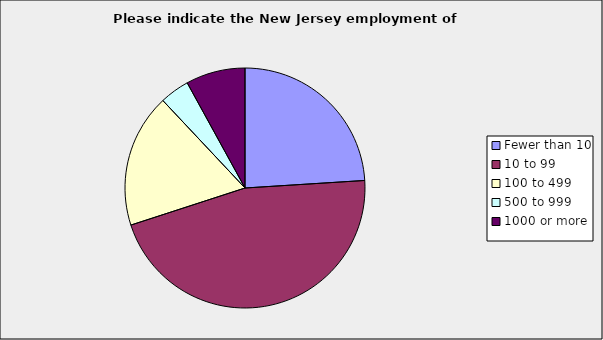
| Category | Series 0 |
|---|---|
| Fewer than 10 | 0.24 |
| 10 to 99 | 0.46 |
| 100 to 499 | 0.18 |
| 500 to 999 | 0.04 |
| 1000 or more | 0.08 |